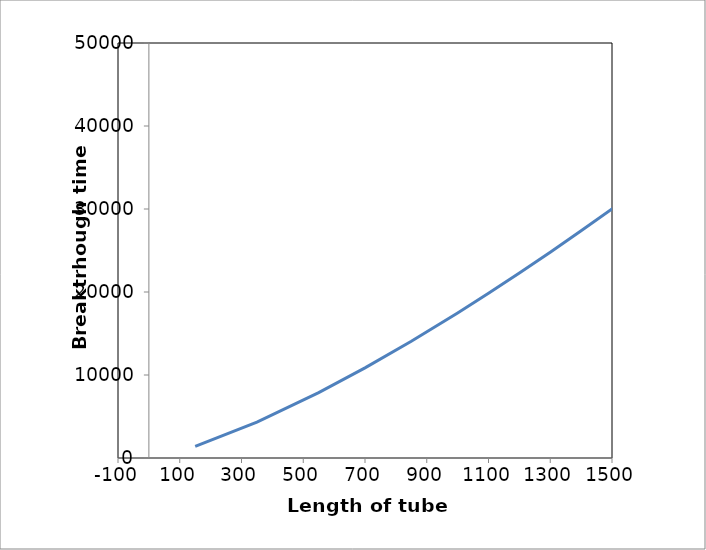
| Category | Series 0 |
|---|---|
| 150.0 | 1392.842 |
| 350.0 | 4310.598 |
| 550.0 | 7875.239 |
| 700.0 | 10862.027 |
| 850.0 | 14071.445 |
| 1000.0 | 17476.192 |
| 1100.0 | 19844.358 |
| 1200.0 | 22285.47 |
| 1300.0 | 24795.409 |
| 1400.0 | 27370.592 |
| 1500.0 | 30007.869 |
| 1600.0 | 32704.445 |